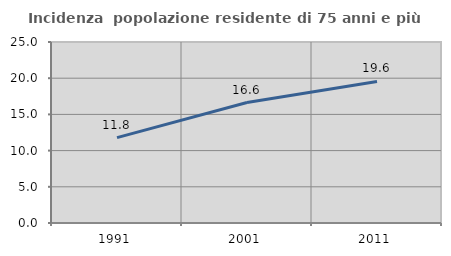
| Category | Incidenza  popolazione residente di 75 anni e più |
|---|---|
| 1991.0 | 11.795 |
| 2001.0 | 16.634 |
| 2011.0 | 19.551 |